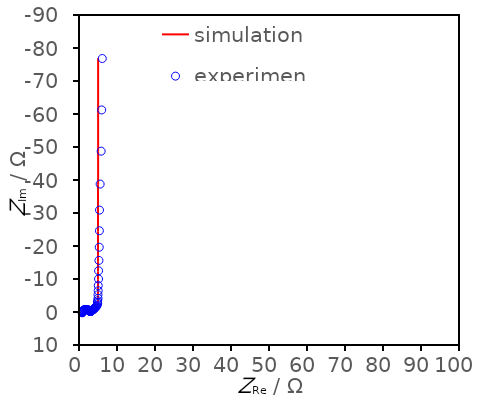
| Category | simulation |
|---|---|
| 0.846072743587637 | 0.245 |
| 0.852160710886366 | 0.161 |
| 0.858791616021728 | 0.098 |
| 0.867280769617151 | 0.039 |
| 0.878250349406911 | -0.017 |
| 0.891692318656025 | -0.069 |
| 0.908261240429333 | -0.12 |
| 0.929255678018949 | -0.171 |
| 0.955337950653234 | -0.225 |
| 0.988415921031397 | -0.281 |
| 1.03030291128179 | -0.342 |
| 1.08258286401196 | -0.406 |
| 1.14701851350012 | -0.472 |
| 1.22578901333974 | -0.539 |
| 1.31973777555517 | -0.604 |
| 1.43000747478169 | -0.663 |
| 1.55499184463373 | -0.711 |
| 1.69194032448988 | -0.746 |
| 1.83612021519858 | -0.762 |
| 1.98132537476358 | -0.76 |
| 2.12198860763731 | -0.74 |
| 2.26615012225926 | -0.699 |
| 2.38468153456303 | -0.65 |
| 2.48757951809143 | -0.593 |
| 2.57473684693166 | -0.534 |
| 2.64726444630272 | -0.476 |
| 2.70696467355861 | -0.421 |
| 2.75589853156083 | -0.371 |
| 2.79609451094047 | -0.327 |
| 2.82938755396007 | -0.289 |
| 2.85735569656312 | -0.257 |
| 2.8813139146048 | -0.231 |
| 2.9023398097047 | -0.21 |
| 2.92131132499471 | -0.194 |
| 2.93894601170689 | -0.182 |
| 2.95583773011048 | -0.175 |
| 2.97248741046352 | -0.172 |
| 2.98932876278993 | -0.172 |
| 3.00674919459332 | -0.175 |
| 3.02510623994558 | -0.182 |
| 3.04474175002029 | -0.192 |
| 3.06599284013041 | -0.205 |
| 3.08920157496452 | -0.222 |
| 3.11472314717684 | -0.242 |
| 3.14293388285241 | -0.266 |
| 3.17423791084839 | -0.293 |
| 3.20907467679834 | -0.325 |
| 3.24792589443715 | -0.361 |
| 3.29132244354794 | -0.402 |
| 3.33985261708559 | -0.449 |
| 3.39417369068677 | -0.502 |
| 3.45502404423381 | -0.561 |
| 3.52317961818387 | -0.628 |
| 3.59939940869105 | -0.704 |
| 3.68468962934521 | -0.789 |
| 3.78100203157573 | -0.886 |
| 3.89154888047464 | -0.995 |
| 4.01949332211836 | -1.115 |
| 4.16490994973159 | -1.24 |
| 4.32188358810811 | -1.367 |
| 4.47860270072861 | -1.496 |
| 4.62149533838769 | -1.638 |
| 4.74065492465709 | -1.813 |
| 4.8325905072186 | -2.044 |
| 4.89927955264949 | -2.359 |
| 4.94549925326972 | -2.783 |
| 4.97652382100801 | -3.347 |
| 4.99690288354107 | -4.084 |
| 5.01009957723551 | -5.036 |
| 5.01856669406327 | -6.255 |
| 5.02396736314385 | -7.806 |
| 5.02739943006046 | -9.773 |
| 5.02957555012032 | -12.26 |
| 5.03095351607298 | -15.4 |
| 5.03182548167819 | -19.36 |
| 5.03237712979298 | -24.351 |
| 5.03272617213565 | -30.639 |
| 5.03294711479121 | -38.558 |
| 5.03308707243241 | -48.531 |
| 5.03317582322768 | -61.088 |
| 5.03323218372191 | -76.898 |